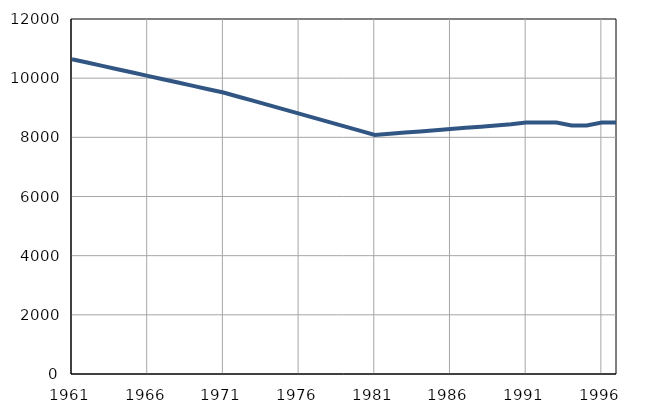
| Category | Population
size |
|---|---|
| 1961.0 | 10642 |
| 1962.0 | 10529 |
| 1963.0 | 10416 |
| 1964.0 | 10303 |
| 1965.0 | 10190 |
| 1966.0 | 10077 |
| 1967.0 | 9964 |
| 1968.0 | 9851 |
| 1969.0 | 9738 |
| 1970.0 | 9625 |
| 1971.0 | 9516 |
| 1972.0 | 9373 |
| 1973.0 | 9230 |
| 1974.0 | 9087 |
| 1975.0 | 8944 |
| 1976.0 | 8801 |
| 1977.0 | 8658 |
| 1978.0 | 8515 |
| 1979.0 | 8372 |
| 1980.0 | 8229 |
| 1981.0 | 8081 |
| 1982.0 | 8121 |
| 1983.0 | 8161 |
| 1984.0 | 8201 |
| 1985.0 | 8241 |
| 1986.0 | 8281 |
| 1987.0 | 8321 |
| 1988.0 | 8361 |
| 1989.0 | 8401 |
| 1990.0 | 8441 |
| 1991.0 | 8500 |
| 1992.0 | 8500 |
| 1993.0 | 8500 |
| 1994.0 | 8400 |
| 1995.0 | 8400 |
| 1996.0 | 8500 |
| 1997.0 | 8500 |